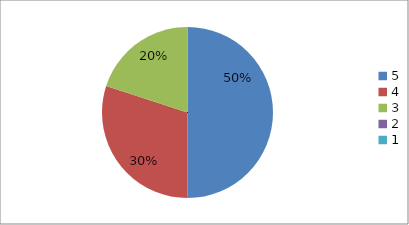
| Category | Series 0 | Series 1 |
|---|---|---|
| 5.0 | 50 | 50 |
| 4.0 | 30 | 30 |
| 3.0 | 20 | 20 |
| 2.0 | 0 | 0 |
| 1.0 | 0 | 0 |